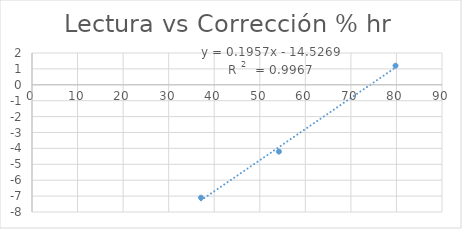
| Category | Series 0 |
|---|---|
| 37.1 | -7.1 |
| 54.2 | -4.2 |
| 79.8 | 1.2 |